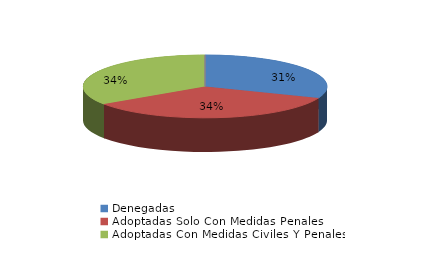
| Category | Series 0 |
|---|---|
| Denegadas | 9 |
| Adoptadas Solo Con Medidas Penales | 10 |
| Adoptadas Con Medidas Civiles Y Penales | 10 |
| Adoptadas Con Medidas Solo Civiles | 0 |